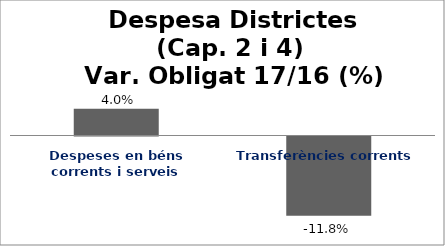
| Category | Series 0 |
|---|---|
| Despeses en béns corrents i serveis | 0.04 |
| Transferències corrents | -0.118 |